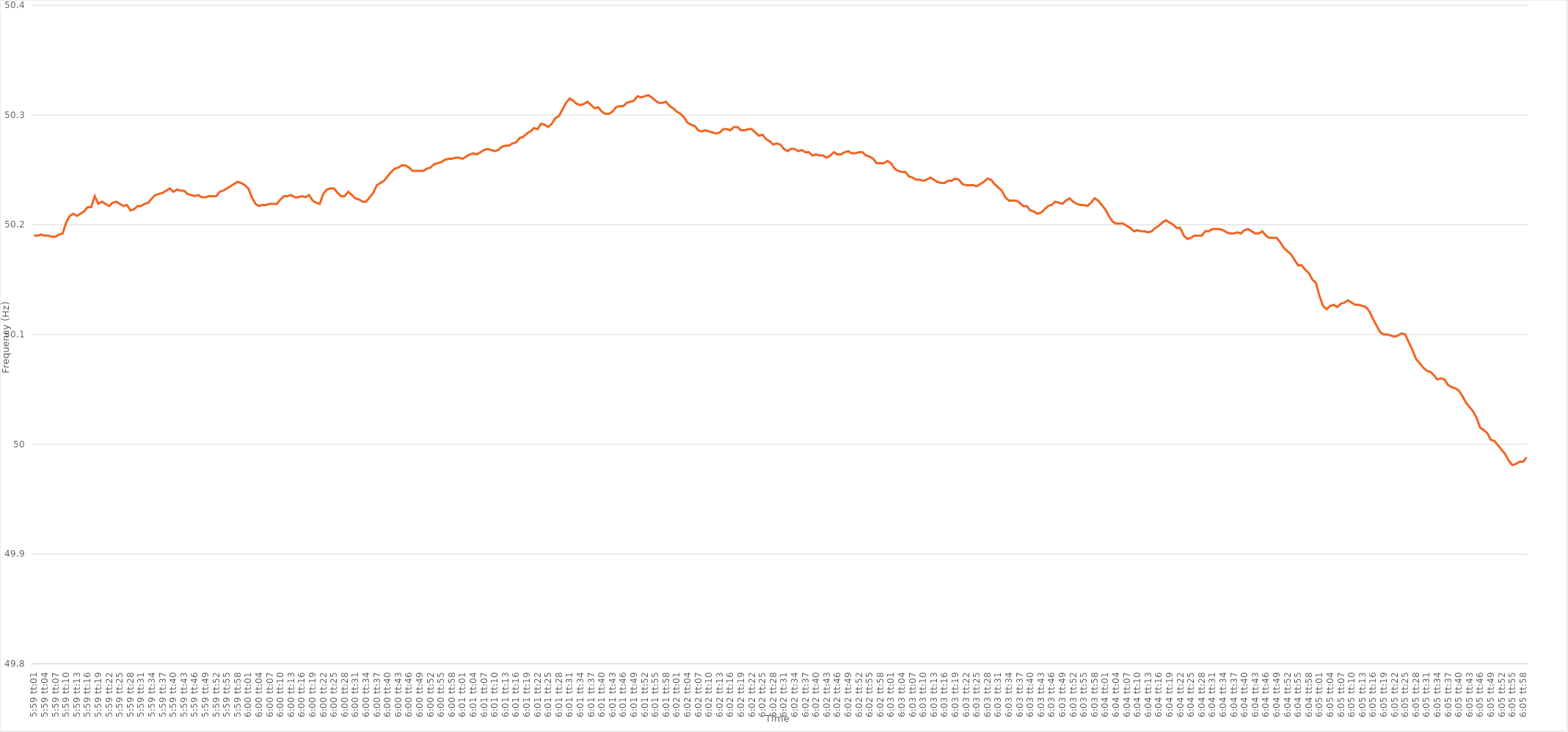
| Category | Series 0 |
|---|---|
| 0.24931712962962962 | 50.19 |
| 0.24932870370370372 | 50.19 |
| 0.24934027777777779 | 50.191 |
| 0.24935185185185185 | 50.19 |
| 0.24936342592592595 | 50.19 |
| 0.249375 | 50.189 |
| 0.24938657407407408 | 50.189 |
| 0.24939814814814812 | 50.191 |
| 0.24940972222222224 | 50.192 |
| 0.24942129629629628 | 50.202 |
| 0.24943287037037035 | 50.208 |
| 0.24944444444444444 | 50.21 |
| 0.2494560185185185 | 50.208 |
| 0.24946759259259257 | 50.21 |
| 0.24947916666666667 | 50.212 |
| 0.24949074074074074 | 50.216 |
| 0.2495023148148148 | 50.216 |
| 0.2495138888888889 | 50.226 |
| 0.24952546296296296 | 50.219 |
| 0.24953703703703703 | 50.221 |
| 0.24954861111111112 | 50.219 |
| 0.2495601851851852 | 50.217 |
| 0.24957175925925926 | 50.22 |
| 0.24958333333333335 | 50.221 |
| 0.24959490740740742 | 50.219 |
| 0.24960648148148148 | 50.217 |
| 0.24961805555555558 | 50.218 |
| 0.24962962962962965 | 50.213 |
| 0.24964120370370368 | 50.214 |
| 0.2496527777777778 | 50.217 |
| 0.24966435185185185 | 50.217 |
| 0.2496759259259259 | 50.219 |
| 0.24968749999999998 | 50.22 |
| 0.24969907407407407 | 50.224 |
| 0.24971064814814814 | 50.227 |
| 0.2497222222222222 | 50.228 |
| 0.2497337962962963 | 50.229 |
| 0.24974537037037037 | 50.231 |
| 0.24975694444444443 | 50.233 |
| 0.24976851851851853 | 50.23 |
| 0.2497800925925926 | 50.232 |
| 0.24979166666666666 | 50.231 |
| 0.24980324074074076 | 50.231 |
| 0.24981481481481482 | 50.228 |
| 0.2498263888888889 | 50.227 |
| 0.24983796296296298 | 50.226 |
| 0.24984953703703705 | 50.227 |
| 0.2498611111111111 | 50.225 |
| 0.2498726851851852 | 50.225 |
| 0.24988425925925925 | 50.226 |
| 0.24989583333333334 | 50.226 |
| 0.24990740740740738 | 50.226 |
| 0.24991898148148148 | 50.23 |
| 0.24993055555555554 | 50.231 |
| 0.2499421296296296 | 50.233 |
| 0.2499537037037037 | 50.235 |
| 0.24996527777777777 | 50.237 |
| 0.24997685185185184 | 50.239 |
| 0.24998842592592593 | 50.238 |
| 0.25 | 50.236 |
| 0.2500115740740741 | 50.233 |
| 0.25002314814814813 | 50.225 |
| 0.2500347222222222 | 50.219 |
| 0.2500462962962963 | 50.217 |
| 0.25005787037037036 | 50.218 |
| 0.25006944444444446 | 50.218 |
| 0.25008101851851855 | 50.219 |
| 0.2500925925925926 | 50.219 |
| 0.2501041666666667 | 50.219 |
| 0.2501157407407408 | 50.223 |
| 0.2501273148148148 | 50.226 |
| 0.25013888888888886 | 50.226 |
| 0.25015046296296295 | 50.227 |
| 0.25016203703703704 | 50.225 |
| 0.2501736111111111 | 50.225 |
| 0.2501851851851852 | 50.226 |
| 0.25019675925925927 | 50.225 |
| 0.2502083333333333 | 50.227 |
| 0.2502199074074074 | 50.222 |
| 0.2502314814814815 | 50.22 |
| 0.25024305555555554 | 50.219 |
| 0.25025462962962963 | 50.228 |
| 0.2502662037037037 | 50.232 |
| 0.25027777777777777 | 50.233 |
| 0.25028935185185186 | 50.233 |
| 0.25030092592592595 | 50.229 |
| 0.2503125 | 50.226 |
| 0.2503240740740741 | 50.226 |
| 0.2503356481481482 | 50.23 |
| 0.2503472222222222 | 50.227 |
| 0.25035879629629626 | 50.224 |
| 0.25037037037037035 | 50.223 |
| 0.25038194444444445 | 50.221 |
| 0.2503935185185185 | 50.221 |
| 0.2504050925925926 | 50.225 |
| 0.2504166666666667 | 50.229 |
| 0.2504282407407407 | 50.236 |
| 0.2504398148148148 | 50.238 |
| 0.2504513888888889 | 50.24 |
| 0.25046296296296294 | 50.244 |
| 0.25047453703703704 | 50.248 |
| 0.25048611111111113 | 50.251 |
| 0.25049768518518517 | 50.252 |
| 0.25050925925925926 | 50.254 |
| 0.25052083333333336 | 50.254 |
| 0.2505324074074074 | 50.252 |
| 0.2505439814814815 | 50.249 |
| 0.2505555555555556 | 50.249 |
| 0.2505671296296296 | 50.249 |
| 0.2505787037037037 | 50.249 |
| 0.2505902777777778 | 50.251 |
| 0.25060185185185185 | 50.252 |
| 0.2506134259259259 | 50.255 |
| 0.250625 | 50.256 |
| 0.2506365740740741 | 50.257 |
| 0.2506481481481481 | 50.259 |
| 0.2506597222222222 | 50.26 |
| 0.2506712962962963 | 50.26 |
| 0.25068287037037035 | 50.261 |
| 0.25069444444444444 | 50.261 |
| 0.25070601851851854 | 50.26 |
| 0.2507175925925926 | 50.262 |
| 0.25072916666666667 | 50.264 |
| 0.25074074074074076 | 50.265 |
| 0.2507523148148148 | 50.264 |
| 0.2507638888888889 | 50.266 |
| 0.250775462962963 | 50.268 |
| 0.25078703703703703 | 50.269 |
| 0.2507986111111111 | 50.268 |
| 0.2508101851851852 | 50.267 |
| 0.25082175925925926 | 50.268 |
| 0.2508333333333333 | 50.271 |
| 0.2508449074074074 | 50.272 |
| 0.2508564814814815 | 50.272 |
| 0.2508680555555555 | 50.274 |
| 0.2508796296296296 | 50.275 |
| 0.2508912037037037 | 50.279 |
| 0.25090277777777775 | 50.28 |
| 0.25091435185185185 | 50.283 |
| 0.25092592592592594 | 50.285 |
| 0.2509375 | 50.288 |
| 0.2509490740740741 | 50.287 |
| 0.25096064814814817 | 50.292 |
| 0.2509722222222222 | 50.291 |
| 0.2509837962962963 | 50.289 |
| 0.2509953703703704 | 50.292 |
| 0.25100694444444444 | 50.297 |
| 0.25101851851851853 | 50.299 |
| 0.2510300925925926 | 50.305 |
| 0.25104166666666666 | 50.311 |
| 0.25105324074074076 | 50.315 |
| 0.25106481481481485 | 50.313 |
| 0.2510763888888889 | 50.31 |
| 0.25108796296296293 | 50.309 |
| 0.251099537037037 | 50.31 |
| 0.2511111111111111 | 50.312 |
| 0.25112268518518516 | 50.309 |
| 0.25113425925925925 | 50.306 |
| 0.25114583333333335 | 50.307 |
| 0.2511574074074074 | 50.303 |
| 0.2511689814814815 | 50.301 |
| 0.2511805555555556 | 50.301 |
| 0.2511921296296296 | 50.303 |
| 0.2512037037037037 | 50.307 |
| 0.2512152777777778 | 50.308 |
| 0.25122685185185184 | 50.308 |
| 0.25123842592592593 | 50.311 |
| 0.25125000000000003 | 50.312 |
| 0.25126157407407407 | 50.313 |
| 0.25127314814814816 | 50.317 |
| 0.25128472222222226 | 50.316 |
| 0.2512962962962963 | 50.317 |
| 0.25130787037037033 | 50.318 |
| 0.25131944444444443 | 50.316 |
| 0.2513310185185185 | 50.313 |
| 0.25134259259259256 | 50.311 |
| 0.25135416666666666 | 50.311 |
| 0.25136574074074075 | 50.312 |
| 0.2513773148148148 | 50.308 |
| 0.2513888888888889 | 50.306 |
| 0.251400462962963 | 50.303 |
| 0.251412037037037 | 50.301 |
| 0.2514236111111111 | 50.298 |
| 0.2514351851851852 | 50.293 |
| 0.25144675925925924 | 50.291 |
| 0.25145833333333334 | 50.29 |
| 0.25146990740740743 | 50.286 |
| 0.2514814814814815 | 50.285 |
| 0.25149305555555557 | 50.286 |
| 0.25150462962962966 | 50.285 |
| 0.2515162037037037 | 50.284 |
| 0.2515277777777778 | 50.283 |
| 0.25153935185185183 | 50.284 |
| 0.25155092592592593 | 50.287 |
| 0.25156249999999997 | 50.287 |
| 0.25157407407407406 | 50.286 |
| 0.25158564814814816 | 50.289 |
| 0.2515972222222222 | 50.289 |
| 0.2516087962962963 | 50.286 |
| 0.2516203703703704 | 50.286 |
| 0.2516319444444444 | 50.287 |
| 0.2516435185185185 | 50.287 |
| 0.2516550925925926 | 50.284 |
| 0.25166666666666665 | 50.281 |
| 0.25167824074074074 | 50.282 |
| 0.25168981481481484 | 50.278 |
| 0.2517013888888889 | 50.276 |
| 0.25171296296296297 | 50.273 |
| 0.25172453703703707 | 50.274 |
| 0.2517361111111111 | 50.273 |
| 0.2517476851851852 | 50.269 |
| 0.2517592592592593 | 50.267 |
| 0.25177083333333333 | 50.269 |
| 0.25178240740740737 | 50.269 |
| 0.25179398148148147 | 50.267 |
| 0.25180555555555556 | 50.268 |
| 0.2518171296296296 | 50.266 |
| 0.2518287037037037 | 50.266 |
| 0.2518402777777778 | 50.263 |
| 0.2518518518518518 | 50.264 |
| 0.2518634259259259 | 50.263 |
| 0.251875 | 50.263 |
| 0.25188657407407405 | 50.261 |
| 0.25189814814814815 | 50.263 |
| 0.25190972222222224 | 50.266 |
| 0.2519212962962963 | 50.264 |
| 0.2519328703703704 | 50.264 |
| 0.25194444444444447 | 50.266 |
| 0.2519560185185185 | 50.267 |
| 0.2519675925925926 | 50.265 |
| 0.2519791666666667 | 50.265 |
| 0.25199074074074074 | 50.266 |
| 0.25200231481481483 | 50.266 |
| 0.25201388888888887 | 50.263 |
| 0.25202546296296297 | 50.262 |
| 0.252037037037037 | 50.26 |
| 0.2520486111111111 | 50.256 |
| 0.2520601851851852 | 50.256 |
| 0.25207175925925923 | 50.256 |
| 0.2520833333333333 | 50.258 |
| 0.2520949074074074 | 50.256 |
| 0.25210648148148146 | 50.251 |
| 0.25211805555555555 | 50.249 |
| 0.25212962962962965 | 50.248 |
| 0.2521412037037037 | 50.248 |
| 0.2521527777777778 | 50.244 |
| 0.2521643518518519 | 50.243 |
| 0.2521759259259259 | 50.241 |
| 0.2521875 | 50.241 |
| 0.2521990740740741 | 50.24 |
| 0.25221064814814814 | 50.241 |
| 0.25222222222222224 | 50.243 |
| 0.25223379629629633 | 50.241 |
| 0.25224537037037037 | 50.239 |
| 0.2522569444444444 | 50.238 |
| 0.2522685185185185 | 50.238 |
| 0.2522800925925926 | 50.24 |
| 0.25229166666666664 | 50.24 |
| 0.25230324074074073 | 50.242 |
| 0.2523148148148148 | 50.241 |
| 0.25232638888888886 | 50.237 |
| 0.25233796296296296 | 50.236 |
| 0.25234953703703705 | 50.236 |
| 0.2523611111111111 | 50.236 |
| 0.2523726851851852 | 50.235 |
| 0.2523842592592593 | 50.237 |
| 0.2523958333333333 | 50.239 |
| 0.2524074074074074 | 50.242 |
| 0.2524189814814815 | 50.241 |
| 0.25243055555555555 | 50.237 |
| 0.25244212962962964 | 50.234 |
| 0.25245370370370374 | 50.231 |
| 0.2524652777777778 | 50.225 |
| 0.25247685185185187 | 50.222 |
| 0.2524884259259259 | 50.222 |
| 0.2525 | 50.222 |
| 0.25251157407407404 | 50.22 |
| 0.25252314814814814 | 50.217 |
| 0.25253472222222223 | 50.217 |
| 0.25254629629629627 | 50.213 |
| 0.25255787037037036 | 50.212 |
| 0.25256944444444446 | 50.21 |
| 0.2525810185185185 | 50.211 |
| 0.2525925925925926 | 50.214 |
| 0.2526041666666667 | 50.217 |
| 0.2526157407407407 | 50.218 |
| 0.2526273148148148 | 50.221 |
| 0.2526388888888889 | 50.22 |
| 0.25265046296296295 | 50.219 |
| 0.25266203703703705 | 50.222 |
| 0.25267361111111114 | 50.224 |
| 0.2526851851851852 | 50.221 |
| 0.2526967592592593 | 50.219 |
| 0.25270833333333337 | 50.218 |
| 0.2527199074074074 | 50.218 |
| 0.25273148148148145 | 50.217 |
| 0.25274305555555554 | 50.22 |
| 0.25275462962962963 | 50.224 |
| 0.2527662037037037 | 50.222 |
| 0.25277777777777777 | 50.218 |
| 0.25278935185185186 | 50.214 |
| 0.2528009259259259 | 50.208 |
| 0.2528125 | 50.203 |
| 0.2528240740740741 | 50.201 |
| 0.25283564814814813 | 50.201 |
| 0.2528472222222222 | 50.201 |
| 0.2528587962962963 | 50.199 |
| 0.25287037037037036 | 50.197 |
| 0.25288194444444445 | 50.194 |
| 0.25289351851851855 | 50.195 |
| 0.2529050925925926 | 50.194 |
| 0.2529166666666667 | 50.194 |
| 0.2529282407407408 | 50.193 |
| 0.2529398148148148 | 50.194 |
| 0.2529513888888889 | 50.197 |
| 0.25296296296296295 | 50.199 |
| 0.25297453703703704 | 50.202 |
| 0.2529861111111111 | 50.204 |
| 0.2529976851851852 | 50.202 |
| 0.25300925925925927 | 50.2 |
| 0.2530208333333333 | 50.197 |
| 0.2530324074074074 | 50.197 |
| 0.2530439814814815 | 50.19 |
| 0.25305555555555553 | 50.187 |
| 0.25306712962962963 | 50.188 |
| 0.2530787037037037 | 50.19 |
| 0.25309027777777776 | 50.19 |
| 0.25310185185185186 | 50.19 |
| 0.25311342592592595 | 50.194 |
| 0.253125 | 50.194 |
| 0.2531365740740741 | 50.196 |
| 0.2531481481481482 | 50.196 |
| 0.2531597222222222 | 50.196 |
| 0.2531712962962963 | 50.195 |
| 0.2531828703703704 | 50.193 |
| 0.25319444444444444 | 50.192 |
| 0.2532060185185185 | 50.192 |
| 0.2532175925925926 | 50.193 |
| 0.25322916666666667 | 50.192 |
| 0.2532407407407407 | 50.195 |
| 0.2532523148148148 | 50.196 |
| 0.2532638888888889 | 50.194 |
| 0.25327546296296294 | 50.192 |
| 0.25328703703703703 | 50.192 |
| 0.2532986111111111 | 50.194 |
| 0.25331018518518517 | 50.19 |
| 0.25332175925925926 | 50.188 |
| 0.25333333333333335 | 50.188 |
| 0.2533449074074074 | 50.188 |
| 0.2533564814814815 | 50.184 |
| 0.2533680555555556 | 50.179 |
| 0.2533796296296296 | 50.176 |
| 0.2533912037037037 | 50.173 |
| 0.2534027777777778 | 50.168 |
| 0.25341435185185185 | 50.163 |
| 0.25342592592592594 | 50.163 |
| 0.2534375 | 50.159 |
| 0.2534490740740741 | 50.156 |
| 0.2534606481481481 | 50.15 |
| 0.2534722222222222 | 50.147 |
| 0.2534837962962963 | 50.135 |
| 0.25349537037037034 | 50.126 |
| 0.25350694444444444 | 50.123 |
| 0.25351851851851853 | 50.126 |
| 0.25353009259259257 | 50.127 |
| 0.25354166666666667 | 50.125 |
| 0.25355324074074076 | 50.128 |
| 0.2535648148148148 | 50.129 |
| 0.2535763888888889 | 50.131 |
| 0.253587962962963 | 50.129 |
| 0.253599537037037 | 50.127 |
| 0.2536111111111111 | 50.127 |
| 0.2536226851851852 | 50.126 |
| 0.25363425925925925 | 50.125 |
| 0.25364583333333335 | 50.121 |
| 0.25365740740740744 | 50.114 |
| 0.2536689814814815 | 50.108 |
| 0.2536805555555555 | 50.102 |
| 0.2536921296296296 | 50.1 |
| 0.2537037037037037 | 50.1 |
| 0.25371527777777775 | 50.099 |
| 0.25372685185185184 | 50.098 |
| 0.25373842592592594 | 50.099 |
| 0.25375 | 50.101 |
| 0.25376157407407407 | 50.1 |
| 0.25377314814814816 | 50.093 |
| 0.2537847222222222 | 50.086 |
| 0.2537962962962963 | 50.078 |
| 0.2538078703703704 | 50.074 |
| 0.25381944444444443 | 50.07 |
| 0.2538310185185185 | 50.067 |
| 0.2538425925925926 | 50.066 |
| 0.25385416666666666 | 50.063 |
| 0.25386574074074075 | 50.059 |
| 0.25387731481481485 | 50.06 |
| 0.2538888888888889 | 50.059 |
| 0.253900462962963 | 50.054 |
| 0.253912037037037 | 50.052 |
| 0.2539236111111111 | 50.051 |
| 0.25393518518518515 | 50.049 |
| 0.25394675925925925 | 50.044 |
| 0.25395833333333334 | 50.038 |
| 0.2539699074074074 | 50.034 |
| 0.2539814814814815 | 50.03 |
| 0.25399305555555557 | 50.024 |
| 0.2540046296296296 | 50.015 |
| 0.2540162037037037 | 50.013 |
| 0.2540277777777778 | 50.01 |
| 0.25403935185185184 | 50.004 |
| 0.25405092592592593 | 50.003 |
| 0.2540625 | 49.999 |
| 0.25407407407407406 | 49.995 |
| 0.25408564814814816 | 49.991 |
| 0.25409722222222225 | 49.985 |
| 0.2541087962962963 | 49.981 |
| 0.2541203703703704 | 49.982 |
| 0.2541319444444445 | 49.984 |
| 0.2541435185185185 | 49.984 |
| 0.25415509259259256 | 49.988 |